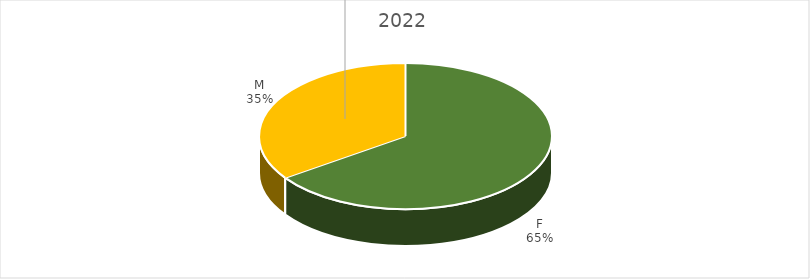
| Category | Series 0 |
|---|---|
| F | 0.653 |
| M | 0.347 |